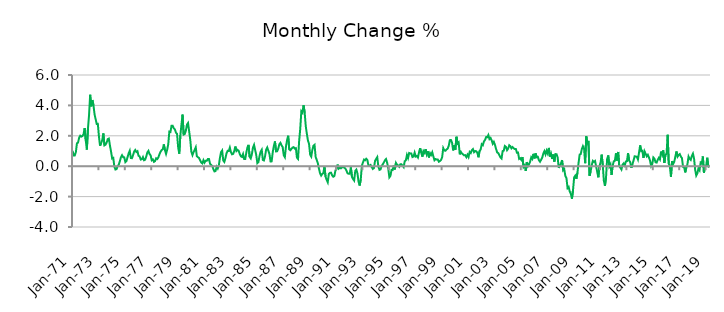
| Category | Series 0 |
|---|---|
| 1971-01-01 | 1.014 |
| 1971-02-01 | 0.711 |
| 1971-03-01 | 0.712 |
| 1971-04-01 | 0.919 |
| 1971-05-01 | 1.51 |
| 1971-06-01 | 1.551 |
| 1971-07-01 | 1.878 |
| 1971-08-01 | 2.005 |
| 1971-09-01 | 1.95 |
| 1971-10-01 | 1.987 |
| 1971-11-01 | 2.104 |
| 1971-12-01 | 2.509 |
| 1972-01-01 | 1.699 |
| 1972-02-01 | 1.094 |
| 1972-03-01 | 2.462 |
| 1972-04-01 | 3.36 |
| 1972-05-01 | 4.697 |
| 1972-06-01 | 3.937 |
| 1972-07-01 | 4.355 |
| 1972-08-01 | 4.026 |
| 1972-09-01 | 3.417 |
| 1972-10-01 | 3.088 |
| 1972-11-01 | 2.774 |
| 1972-12-01 | 2.784 |
| 1973-01-01 | 1.938 |
| 1973-02-01 | 1.343 |
| 1973-03-01 | 1.524 |
| 1973-04-01 | 1.712 |
| 1973-05-01 | 2.158 |
| 1973-06-01 | 1.373 |
| 1973-07-01 | 1.418 |
| 1973-08-01 | 1.551 |
| 1973-09-01 | 1.782 |
| 1973-10-01 | 1.816 |
| 1973-11-01 | 1.359 |
| 1973-12-01 | 0.961 |
| 1974-01-01 | 0.511 |
| 1974-02-01 | 0.548 |
| 1974-03-01 | -0.022 |
| 1974-04-01 | -0.216 |
| 1974-05-01 | -0.191 |
| 1974-06-01 | 0.007 |
| 1974-07-01 | 0.097 |
| 1974-08-01 | 0.326 |
| 1974-09-01 | 0.591 |
| 1974-10-01 | 0.722 |
| 1974-11-01 | 0.594 |
| 1974-12-01 | 0.583 |
| 1975-01-01 | 0.268 |
| 1975-02-01 | 0.337 |
| 1975-03-01 | 0.597 |
| 1975-04-01 | 0.845 |
| 1975-05-01 | 1.017 |
| 1975-06-01 | 0.539 |
| 1975-07-01 | 0.526 |
| 1975-08-01 | 0.722 |
| 1975-09-01 | 0.97 |
| 1975-10-01 | 1.067 |
| 1975-11-01 | 0.93 |
| 1975-12-01 | 0.985 |
| 1976-01-01 | 0.687 |
| 1976-02-01 | 0.643 |
| 1976-03-01 | 0.437 |
| 1976-04-01 | 0.463 |
| 1976-05-01 | 0.603 |
| 1976-06-01 | 0.392 |
| 1976-07-01 | 0.432 |
| 1976-08-01 | 0.636 |
| 1976-09-01 | 0.905 |
| 1976-10-01 | 1.011 |
| 1976-11-01 | 0.8 |
| 1976-12-01 | 0.709 |
| 1977-01-01 | 0.392 |
| 1977-02-01 | 0.448 |
| 1977-03-01 | 0.289 |
| 1977-04-01 | 0.338 |
| 1977-05-01 | 0.521 |
| 1977-06-01 | 0.47 |
| 1977-07-01 | 0.575 |
| 1977-08-01 | 0.784 |
| 1977-09-01 | 0.951 |
| 1977-10-01 | 1.061 |
| 1977-11-01 | 1.111 |
| 1977-12-01 | 1.434 |
| 1978-01-01 | 1.05 |
| 1978-02-01 | 0.811 |
| 1978-03-01 | 1.084 |
| 1978-04-01 | 1.443 |
| 1978-05-01 | 2.28 |
| 1978-06-01 | 2.255 |
| 1978-07-01 | 2.668 |
| 1978-08-01 | 2.665 |
| 1978-09-01 | 2.498 |
| 1978-10-01 | 2.424 |
| 1978-11-01 | 2.207 |
| 1978-12-01 | 2.133 |
| 1979-01-01 | 1.242 |
| 1979-02-01 | 0.823 |
| 1979-03-01 | 2.034 |
| 1979-04-01 | 2.732 |
| 1979-05-01 | 3.394 |
| 1979-06-01 | 2.083 |
| 1979-07-01 | 2.118 |
| 1979-08-01 | 2.335 |
| 1979-09-01 | 2.734 |
| 1979-10-01 | 2.841 |
| 1979-11-01 | 2.3 |
| 1979-12-01 | 1.747 |
| 1980-01-01 | 0.943 |
| 1980-02-01 | 0.726 |
| 1980-03-01 | 0.925 |
| 1980-04-01 | 1.073 |
| 1980-05-01 | 1.242 |
| 1980-06-01 | 0.656 |
| 1980-07-01 | 0.591 |
| 1980-08-01 | 0.543 |
| 1980-09-01 | 0.381 |
| 1980-10-01 | 0.243 |
| 1980-11-01 | 0.186 |
| 1980-12-01 | 0.395 |
| 1981-01-01 | 0.234 |
| 1981-02-01 | 0.354 |
| 1981-03-01 | 0.354 |
| 1981-04-01 | 0.474 |
| 1981-05-01 | 0.478 |
| 1981-06-01 | 0.161 |
| 1981-07-01 | 0.077 |
| 1981-08-01 | 0.019 |
| 1981-09-01 | -0.188 |
| 1981-10-01 | -0.344 |
| 1981-11-01 | -0.317 |
| 1981-12-01 | -0.035 |
| 1982-01-01 | -0.155 |
| 1982-02-01 | 0.068 |
| 1982-03-01 | 0.555 |
| 1982-04-01 | 0.929 |
| 1982-05-01 | 1.031 |
| 1982-06-01 | 0.372 |
| 1982-07-01 | 0.28 |
| 1982-08-01 | 0.532 |
| 1982-09-01 | 0.859 |
| 1982-10-01 | 1.012 |
| 1982-11-01 | 0.998 |
| 1982-12-01 | 1.225 |
| 1983-01-01 | 0.92 |
| 1983-02-01 | 0.783 |
| 1983-03-01 | 0.81 |
| 1983-04-01 | 0.995 |
| 1983-05-01 | 1.293 |
| 1983-06-01 | 1.001 |
| 1983-07-01 | 1.08 |
| 1983-08-01 | 1.015 |
| 1983-09-01 | 0.803 |
| 1983-10-01 | 0.652 |
| 1983-11-01 | 0.611 |
| 1983-12-01 | 0.798 |
| 1984-01-01 | 0.473 |
| 1984-02-01 | 0.478 |
| 1984-03-01 | 0.903 |
| 1984-04-01 | 1.241 |
| 1984-05-01 | 1.404 |
| 1984-06-01 | 0.614 |
| 1984-07-01 | 0.511 |
| 1984-08-01 | 0.774 |
| 1984-09-01 | 1.225 |
| 1984-10-01 | 1.401 |
| 1984-11-01 | 1.068 |
| 1984-12-01 | 0.734 |
| 1985-01-01 | 0.202 |
| 1985-02-01 | 0.279 |
| 1985-03-01 | 0.684 |
| 1985-04-01 | 0.954 |
| 1985-05-01 | 1.079 |
| 1985-06-01 | 0.413 |
| 1985-07-01 | 0.38 |
| 1985-08-01 | 0.656 |
| 1985-09-01 | 1.087 |
| 1985-10-01 | 1.228 |
| 1985-11-01 | 1.02 |
| 1985-12-01 | 0.807 |
| 1986-01-01 | 0.311 |
| 1986-02-01 | 0.317 |
| 1986-03-01 | 0.923 |
| 1986-04-01 | 1.322 |
| 1986-05-01 | 1.629 |
| 1986-06-01 | 0.97 |
| 1986-07-01 | 0.982 |
| 1986-08-01 | 1.161 |
| 1986-09-01 | 1.443 |
| 1986-10-01 | 1.536 |
| 1986-11-01 | 1.373 |
| 1986-12-01 | 1.263 |
| 1987-01-01 | 0.724 |
| 1987-02-01 | 0.595 |
| 1987-03-01 | 1.283 |
| 1987-04-01 | 1.705 |
| 1987-05-01 | 2.003 |
| 1987-06-01 | 1.108 |
| 1987-07-01 | 1.049 |
| 1987-08-01 | 1.142 |
| 1987-09-01 | 1.226 |
| 1987-10-01 | 1.253 |
| 1987-11-01 | 1.16 |
| 1987-12-01 | 1.188 |
| 1988-01-01 | 0.558 |
| 1988-02-01 | 0.478 |
| 1988-03-01 | 1.666 |
| 1988-04-01 | 2.466 |
| 1988-05-01 | 3.62 |
| 1988-06-01 | 3.526 |
| 1988-07-01 | 4.01 |
| 1988-08-01 | 3.546 |
| 1988-09-01 | 2.637 |
| 1988-10-01 | 2.133 |
| 1988-11-01 | 1.68 |
| 1988-12-01 | 1.467 |
| 1989-01-01 | 0.756 |
| 1989-02-01 | 0.634 |
| 1989-03-01 | 1.069 |
| 1989-04-01 | 1.347 |
| 1989-05-01 | 1.408 |
| 1989-06-01 | 0.607 |
| 1989-07-01 | 0.411 |
| 1989-08-01 | 0.192 |
| 1989-09-01 | -0.165 |
| 1989-10-01 | -0.462 |
| 1989-11-01 | -0.618 |
| 1989-12-01 | -0.507 |
| 1990-01-01 | -0.459 |
| 1990-02-01 | -0.019 |
| 1990-03-01 | -0.686 |
| 1990-04-01 | -0.897 |
| 1990-05-01 | -1.058 |
| 1990-06-01 | -0.51 |
| 1990-07-01 | -0.437 |
| 1990-08-01 | -0.428 |
| 1990-09-01 | -0.604 |
| 1990-10-01 | -0.695 |
| 1990-11-01 | -0.649 |
| 1990-12-01 | -0.278 |
| 1991-01-01 | -0.196 |
| 1991-02-01 | 0.105 |
| 1991-03-01 | -0.159 |
| 1991-04-01 | -0.105 |
| 1991-05-01 | -0.139 |
| 1991-06-01 | -0.062 |
| 1991-07-01 | -0.066 |
| 1991-08-01 | -0.093 |
| 1991-09-01 | -0.159 |
| 1991-10-01 | -0.285 |
| 1991-11-01 | -0.467 |
| 1991-12-01 | -0.497 |
| 1992-01-01 | -0.494 |
| 1992-02-01 | -0.076 |
| 1992-03-01 | -0.697 |
| 1992-04-01 | -0.848 |
| 1992-05-01 | -0.944 |
| 1992-06-01 | -0.312 |
| 1992-07-01 | -0.225 |
| 1992-08-01 | -0.473 |
| 1992-09-01 | -1.015 |
| 1992-10-01 | -1.272 |
| 1992-11-01 | -0.873 |
| 1992-12-01 | 0.026 |
| 1993-01-01 | 0.247 |
| 1993-02-01 | 0.437 |
| 1993-03-01 | 0.391 |
| 1993-04-01 | 0.487 |
| 1993-05-01 | 0.413 |
| 1993-06-01 | 0.047 |
| 1993-07-01 | 0.03 |
| 1993-08-01 | 0.082 |
| 1993-09-01 | -0.063 |
| 1993-10-01 | -0.18 |
| 1993-11-01 | -0.118 |
| 1993-12-01 | 0.35 |
| 1994-01-01 | 0.48 |
| 1994-02-01 | 0.595 |
| 1994-03-01 | -0.023 |
| 1994-04-01 | -0.241 |
| 1994-05-01 | -0.212 |
| 1994-06-01 | 0.019 |
| 1994-07-01 | 0.12 |
| 1994-08-01 | 0.247 |
| 1994-09-01 | 0.391 |
| 1994-10-01 | 0.472 |
| 1994-11-01 | 0.222 |
| 1994-12-01 | -0.131 |
| 1995-01-01 | -0.733 |
| 1995-02-01 | -0.635 |
| 1995-03-01 | -0.24 |
| 1995-04-01 | -0.251 |
| 1995-05-01 | 0.043 |
| 1995-06-01 | -0.212 |
| 1995-07-01 | 0.218 |
| 1995-08-01 | 0.097 |
| 1995-09-01 | 0.057 |
| 1995-10-01 | -0.036 |
| 1995-11-01 | 0.126 |
| 1995-12-01 | 0.123 |
| 1996-01-01 | 0.036 |
| 1996-02-01 | -0.061 |
| 1996-03-01 | 0.33 |
| 1996-04-01 | 0.389 |
| 1996-05-01 | 0.736 |
| 1996-06-01 | 0.535 |
| 1996-07-01 | 0.868 |
| 1996-08-01 | 0.833 |
| 1996-09-01 | 0.834 |
| 1996-10-01 | 0.603 |
| 1996-11-01 | 0.635 |
| 1996-12-01 | 0.892 |
| 1997-01-01 | 0.634 |
| 1997-02-01 | 0.672 |
| 1997-03-01 | 0.57 |
| 1997-04-01 | 0.919 |
| 1997-05-01 | 1.19 |
| 1997-06-01 | 0.893 |
| 1997-07-01 | 0.625 |
| 1997-08-01 | 0.99 |
| 1997-09-01 | 0.877 |
| 1997-10-01 | 1.126 |
| 1997-11-01 | 0.779 |
| 1997-12-01 | 0.981 |
| 1998-01-01 | 0.576 |
| 1998-02-01 | 0.861 |
| 1998-03-01 | 0.744 |
| 1998-04-01 | 0.917 |
| 1998-05-01 | 0.646 |
| 1998-06-01 | 0.394 |
| 1998-07-01 | 0.47 |
| 1998-08-01 | 0.438 |
| 1998-09-01 | 0.441 |
| 1998-10-01 | 0.291 |
| 1998-11-01 | 0.339 |
| 1998-12-01 | 0.406 |
| 1999-01-01 | 0.599 |
| 1999-02-01 | 1.189 |
| 1999-03-01 | 1.036 |
| 1999-04-01 | 1.017 |
| 1999-05-01 | 1.102 |
| 1999-06-01 | 1.154 |
| 1999-07-01 | 1.343 |
| 1999-08-01 | 1.715 |
| 1999-09-01 | 1.719 |
| 1999-10-01 | 1.552 |
| 1999-11-01 | 1.038 |
| 1999-12-01 | 1.38 |
| 2000-01-01 | 1.085 |
| 2000-02-01 | 1.936 |
| 2000-03-01 | 1.491 |
| 2000-04-01 | 1.566 |
| 2000-05-01 | 0.781 |
| 2000-06-01 | 0.949 |
| 2000-07-01 | 0.839 |
| 2000-08-01 | 0.775 |
| 2000-09-01 | 0.714 |
| 2000-10-01 | 0.729 |
| 2000-11-01 | 0.596 |
| 2000-12-01 | 0.754 |
| 2001-01-01 | 0.606 |
| 2001-02-01 | 0.935 |
| 2001-03-01 | 0.867 |
| 2001-04-01 | 1.055 |
| 2001-05-01 | 1.127 |
| 2001-06-01 | 0.924 |
| 2001-07-01 | 0.998 |
| 2001-08-01 | 0.985 |
| 2001-09-01 | 0.883 |
| 2001-10-01 | 0.588 |
| 2001-11-01 | 0.997 |
| 2001-12-01 | 1.094 |
| 2002-01-01 | 1.445 |
| 2002-02-01 | 1.384 |
| 2002-03-01 | 1.631 |
| 2002-04-01 | 1.728 |
| 2002-05-01 | 1.918 |
| 2002-06-01 | 1.906 |
| 2002-07-01 | 2.048 |
| 2002-08-01 | 1.783 |
| 2002-09-01 | 1.859 |
| 2002-10-01 | 1.71 |
| 2002-11-01 | 1.477 |
| 2002-12-01 | 1.602 |
| 2003-01-01 | 1.407 |
| 2003-02-01 | 1.139 |
| 2003-03-01 | 0.91 |
| 2003-04-01 | 0.863 |
| 2003-05-01 | 0.726 |
| 2003-06-01 | 0.579 |
| 2003-07-01 | 0.508 |
| 2003-08-01 | 0.993 |
| 2003-09-01 | 1.027 |
| 2003-10-01 | 1.329 |
| 2003-11-01 | 1.273 |
| 2003-12-01 | 1.053 |
| 2004-01-01 | 1.155 |
| 2004-02-01 | 1.378 |
| 2004-03-01 | 1.315 |
| 2004-04-01 | 1.176 |
| 2004-05-01 | 1.263 |
| 2004-06-01 | 1.184 |
| 2004-07-01 | 1.129 |
| 2004-08-01 | 1.135 |
| 2004-09-01 | 0.885 |
| 2004-10-01 | 0.896 |
| 2004-11-01 | 0.481 |
| 2004-12-01 | 0.525 |
| 2005-01-01 | 0.412 |
| 2005-02-01 | 0.601 |
| 2005-03-01 | -0.056 |
| 2005-04-01 | 0.041 |
| 2005-05-01 | -0.312 |
| 2005-06-01 | 0.273 |
| 2005-07-01 | 0.005 |
| 2005-08-01 | 0.13 |
| 2005-09-01 | 0.301 |
| 2005-10-01 | 0.587 |
| 2005-11-01 | 0.481 |
| 2005-12-01 | 0.815 |
| 2006-01-01 | 0.512 |
| 2006-02-01 | 0.839 |
| 2006-03-01 | 0.59 |
| 2006-04-01 | 0.61 |
| 2006-05-01 | 0.39 |
| 2006-06-01 | 0.294 |
| 2006-07-01 | 0.43 |
| 2006-08-01 | 0.57 |
| 2006-09-01 | 0.838 |
| 2006-10-01 | 0.993 |
| 2006-11-01 | 0.782 |
| 2006-12-01 | 1.025 |
| 2007-01-01 | 0.837 |
| 2007-02-01 | 1.203 |
| 2007-03-01 | 0.635 |
| 2007-04-01 | 0.824 |
| 2007-05-01 | 0.476 |
| 2007-06-01 | 0.769 |
| 2007-07-01 | 0.305 |
| 2007-08-01 | 0.796 |
| 2007-09-01 | 0.787 |
| 2007-10-01 | 0.58 |
| 2007-11-01 | -0.112 |
| 2007-12-01 | 0.065 |
| 2008-01-01 | 0.173 |
| 2008-02-01 | 0.401 |
| 2008-03-01 | -0.272 |
| 2008-04-01 | -0.195 |
| 2008-05-01 | -0.647 |
| 2008-06-01 | -0.781 |
| 2008-07-01 | -1.442 |
| 2008-08-01 | -1.364 |
| 2008-09-01 | -1.669 |
| 2008-10-01 | -1.821 |
| 2008-11-01 | -2.138 |
| 2008-12-01 | -1.553 |
| 2009-01-01 | -0.731 |
| 2009-02-01 | -0.621 |
| 2009-03-01 | -0.825 |
| 2009-04-01 | -0.427 |
| 2009-05-01 | 0.213 |
| 2009-06-01 | 0.764 |
| 2009-07-01 | 0.798 |
| 2009-08-01 | 1.133 |
| 2009-09-01 | 1.32 |
| 2009-10-01 | 1.163 |
| 2009-11-01 | 0.201 |
| 2009-12-01 | 1.966 |
| 2010-01-01 | 1.507 |
| 2010-02-01 | 1.665 |
| 2010-03-01 | -0.631 |
| 2010-04-01 | -0.333 |
| 2010-05-01 | 0.073 |
| 2010-06-01 | 0.35 |
| 2010-07-01 | 0.284 |
| 2010-08-01 | 0.345 |
| 2010-09-01 | -0.014 |
| 2010-10-01 | -0.392 |
| 2010-11-01 | -0.732 |
| 2010-12-01 | -0.005 |
| 2011-01-01 | 0.24 |
| 2011-02-01 | 0.761 |
| 2011-03-01 | 0.093 |
| 2011-04-01 | -0.951 |
| 2011-05-01 | -1.297 |
| 2011-06-01 | -0.711 |
| 2011-07-01 | 0.487 |
| 2011-08-01 | 0.71 |
| 2011-09-01 | -0.012 |
| 2011-10-01 | 0.126 |
| 2011-11-01 | -0.566 |
| 2011-12-01 | 0.032 |
| 2012-01-01 | 0.323 |
| 2012-02-01 | 0.352 |
| 2012-03-01 | 0.849 |
| 2012-04-01 | 0.375 |
| 2012-05-01 | 0.938 |
| 2012-06-01 | 0.004 |
| 2012-07-01 | -0.1 |
| 2012-08-01 | -0.217 |
| 2012-09-01 | 0.1 |
| 2012-10-01 | 0.185 |
| 2012-11-01 | 0.047 |
| 2012-12-01 | 0.311 |
| 2013-01-01 | 0.331 |
| 2013-02-01 | 0.856 |
| 2013-03-01 | 0.368 |
| 2013-04-01 | 0.266 |
| 2013-05-01 | -0.109 |
| 2013-06-01 | 0.137 |
| 2013-07-01 | 0.377 |
| 2013-08-01 | 0.653 |
| 2013-09-01 | 0.637 |
| 2013-10-01 | 0.618 |
| 2013-11-01 | 0.442 |
| 2013-12-01 | 0.903 |
| 2014-01-01 | 1.372 |
| 2014-02-01 | 0.988 |
| 2014-03-01 | 1.017 |
| 2014-04-01 | 0.553 |
| 2014-05-01 | 0.975 |
| 2014-06-01 | 0.817 |
| 2014-07-01 | 0.649 |
| 2014-08-01 | 0.748 |
| 2014-09-01 | 0.573 |
| 2014-10-01 | 0.364 |
| 2014-11-01 | 0.006 |
| 2014-12-01 | 0.136 |
| 2015-01-01 | 0.576 |
| 2015-02-01 | 0.494 |
| 2015-03-01 | 0.259 |
| 2015-04-01 | 0.24 |
| 2015-05-01 | 0.421 |
| 2015-06-01 | 0.552 |
| 2015-07-01 | 0.44 |
| 2015-08-01 | 0.958 |
| 2015-09-01 | 0.755 |
| 2015-10-01 | 1.043 |
| 2015-11-01 | 0.212 |
| 2015-12-01 | 0.764 |
| 2016-01-01 | 0.798 |
| 2016-02-01 | 2.067 |
| 2016-03-01 | 0.169 |
| 2016-04-01 | -0.006 |
| 2016-05-01 | -0.698 |
| 2016-06-01 | 0.334 |
| 2016-07-01 | 0.14 |
| 2016-08-01 | 0.289 |
| 2016-09-01 | 0.636 |
| 2016-10-01 | 0.968 |
| 2016-11-01 | 0.632 |
| 2016-12-01 | 0.743 |
| 2017-01-01 | 0.799 |
| 2017-02-01 | 0.633 |
| 2017-03-01 | 0.532 |
| 2017-04-01 | -0.041 |
| 2017-05-01 | -0.065 |
| 2017-06-01 | -0.409 |
| 2017-07-01 | -0.073 |
| 2017-08-01 | 0.136 |
| 2017-09-01 | 0.638 |
| 2017-10-01 | 0.488 |
| 2017-11-01 | 0.417 |
| 2017-12-01 | 0.673 |
| 2018-01-01 | 0.825 |
| 2018-02-01 | 0.505 |
| 2018-03-01 | -0.23 |
| 2018-04-01 | -0.614 |
| 2018-05-01 | -0.477 |
| 2018-06-01 | -0.144 |
| 2018-07-01 | -0.267 |
| 2018-08-01 | 0.239 |
| 2018-09-01 | 0.177 |
| 2018-10-01 | 0.64 |
| 2018-11-01 | -0.426 |
| 2018-12-01 | 0.005 |
| 2019-01-01 | 0.012 |
| 2019-02-01 | 0.558 |
| 2019-03-01 | -0.024 |
| 2019-04-01 | -0.06 |